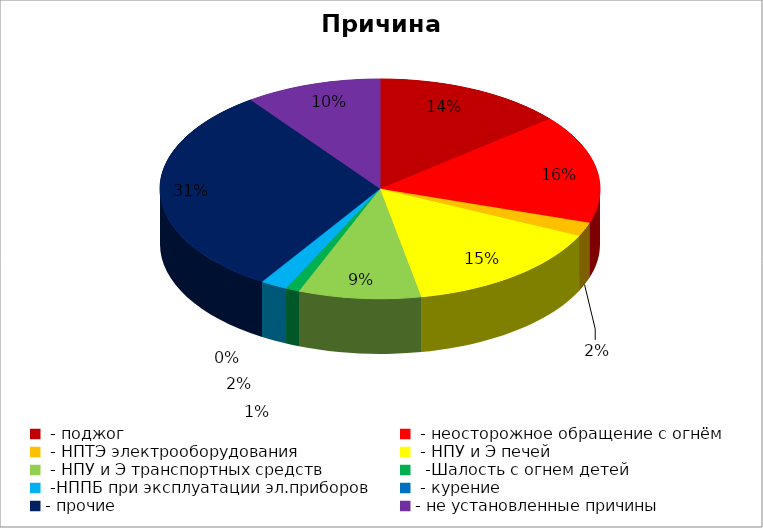
| Category | Причина пожара |
|---|---|
|  - поджог | 14 |
|  - неосторожное обращение с огнём | 16 |
|  - НПТЭ электрооборудования | 2 |
|  - НПУ и Э печей | 15 |
|  - НПУ и Э транспортных средств | 9 |
|   -Шалость с огнем детей | 1 |
|  -НППБ при эксплуатации эл.приборов | 2 |
|  - курение | 0 |
| - прочие | 31 |
| - не установленные причины | 10 |